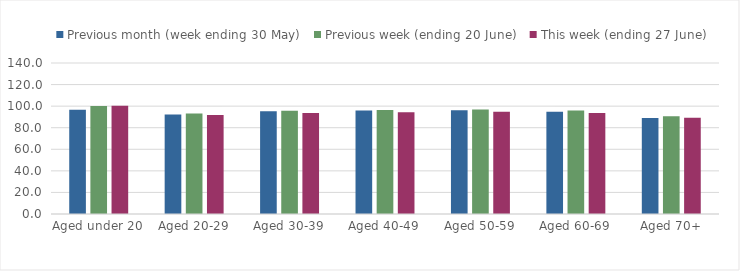
| Category | Previous month (week ending 30 May) | Previous week (ending 20 June) | This week (ending 27 June) |
|---|---|---|---|
| Aged under 20 | 96.572 | 100.09 | 100.3 |
| Aged 20-29 | 92.176 | 93.146 | 91.851 |
| Aged 30-39 | 95.367 | 95.813 | 93.7 |
| Aged 40-49 | 95.891 | 96.356 | 94.415 |
| Aged 50-59 | 96.118 | 96.865 | 94.796 |
| Aged 60-69 | 94.749 | 95.965 | 93.715 |
| Aged 70+ | 88.899 | 90.613 | 89.176 |